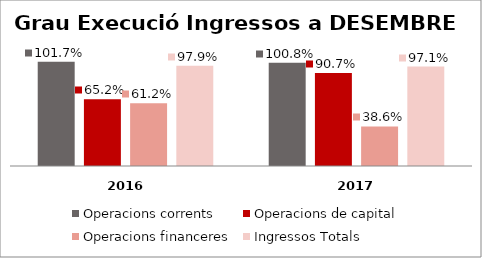
| Category | Operacions corrents | Operacions de capital | Operacions financeres | Ingressos Totals |
|---|---|---|---|---|
| 0 | 1.017 | 0.652 | 0.612 | 0.979 |
| 1 | 1.008 | 0.907 | 0.386 | 0.971 |